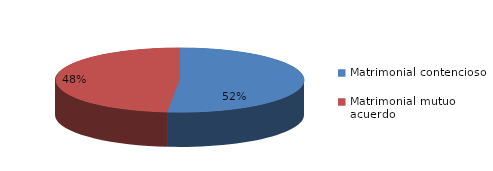
| Category | Series 0 |
|---|---|
| 0 | 464 |
| 1 | 436 |